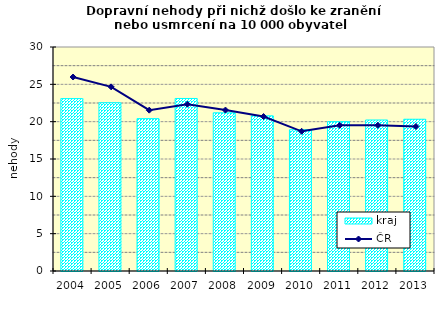
| Category | kraj |
|---|---|
| 2004.0 | 23.086 |
| 2005.0 | 22.536 |
| 2006.0 | 20.409 |
| 2007.0 | 23.107 |
| 2008.0 | 21.19 |
| 2009.0 | 20.781 |
| 2010.0 | 18.92 |
| 2011.0 | 20.005 |
| 2012.0 | 20.225 |
| 2013.0 | 20.325 |